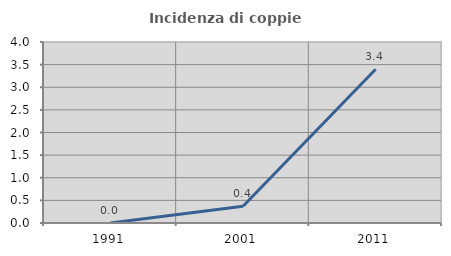
| Category | Incidenza di coppie miste |
|---|---|
| 1991.0 | 0 |
| 2001.0 | 0.369 |
| 2011.0 | 3.396 |